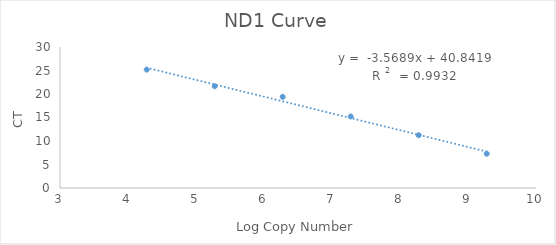
| Category | ND1 Curve |
|---|---|
| 9.275167333820246 | 7.289 |
| 8.275167333820246 | 11.229 |
| 7.275167333820245 | 15.223 |
| 6.275167333820245 | 19.398 |
| 5.275167333820245 | 21.653 |
| 4.275167333820245 | 25.181 |